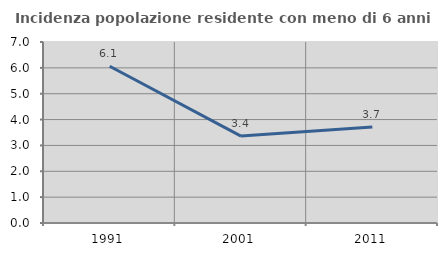
| Category | Incidenza popolazione residente con meno di 6 anni |
|---|---|
| 1991.0 | 6.061 |
| 2001.0 | 3.361 |
| 2011.0 | 3.712 |